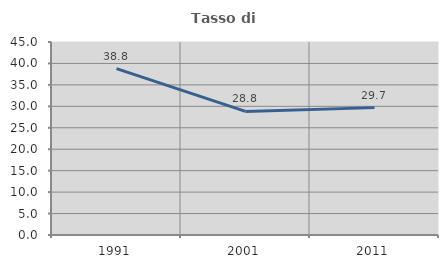
| Category | Tasso di occupazione   |
|---|---|
| 1991.0 | 38.777 |
| 2001.0 | 28.813 |
| 2011.0 | 29.699 |